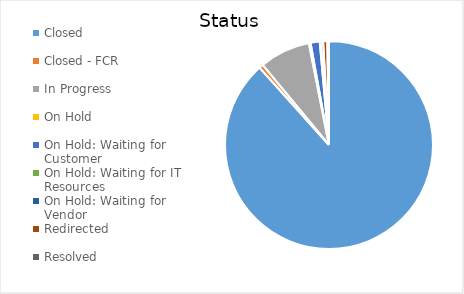
| Category | Series 0 |
|---|---|
| Closed | 682 |
| Closed - FCR | 5 |
| In Progress | 61 |
| On Hold | 2 |
| On Hold: Waiting for Customer | 11 |
| On Hold: Waiting for IT Resources | 1 |
| On Hold: Waiting for Vendor | 3 |
| Redirected | 5 |
| Resolved | 2 |